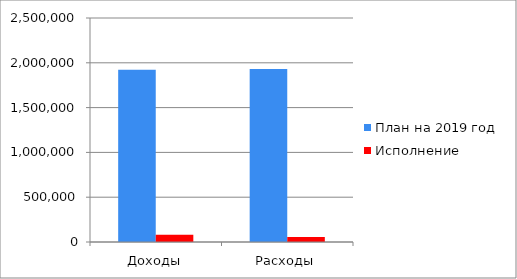
| Category | План на 2019 год | Исполнение |
|---|---|---|
| Доходы | 1922378 | 80291 |
| Расходы | 1930378 | 57132 |